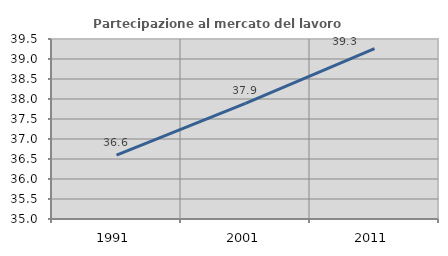
| Category | Partecipazione al mercato del lavoro  femminile |
|---|---|
| 1991.0 | 36.599 |
| 2001.0 | 37.888 |
| 2011.0 | 39.257 |